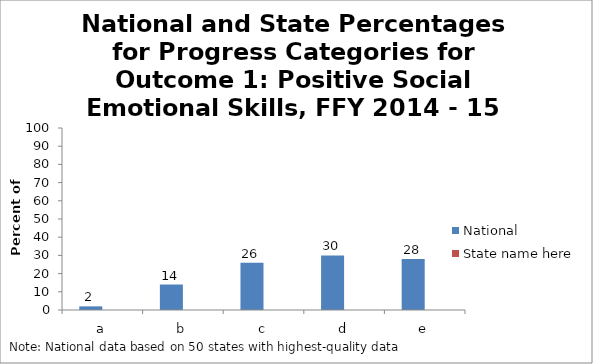
| Category | National | State name here |
|---|---|---|
| a | 2 |  |
| b | 14 |  |
| c | 26 |  |
| d | 30 |  |
| e | 28 |  |